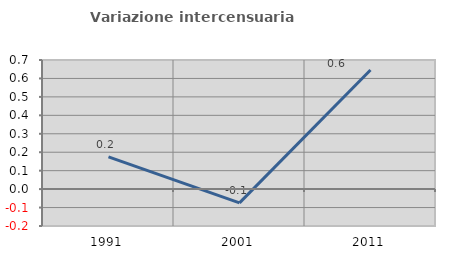
| Category | Variazione intercensuaria annua |
|---|---|
| 1991.0 | 0.175 |
| 2001.0 | -0.074 |
| 2011.0 | 0.646 |